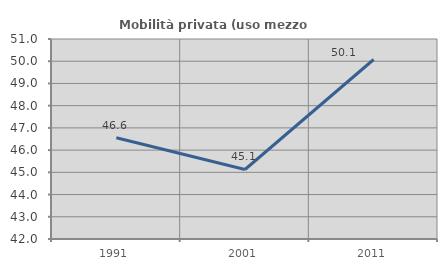
| Category | Mobilità privata (uso mezzo privato) |
|---|---|
| 1991.0 | 46.553 |
| 2001.0 | 45.128 |
| 2011.0 | 50.078 |